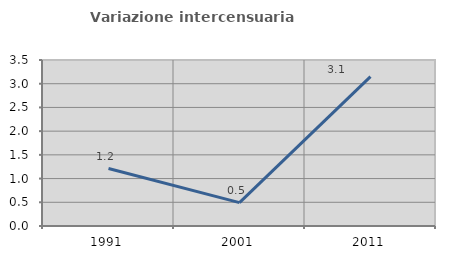
| Category | Variazione intercensuaria annua |
|---|---|
| 1991.0 | 1.211 |
| 2001.0 | 0.494 |
| 2011.0 | 3.149 |